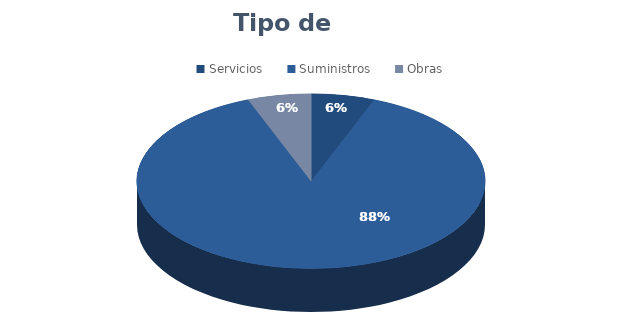
| Category | Series 0 |
|---|---|
| Servicios | 1 |
| Suministros | 15 |
| Obras | 1 |